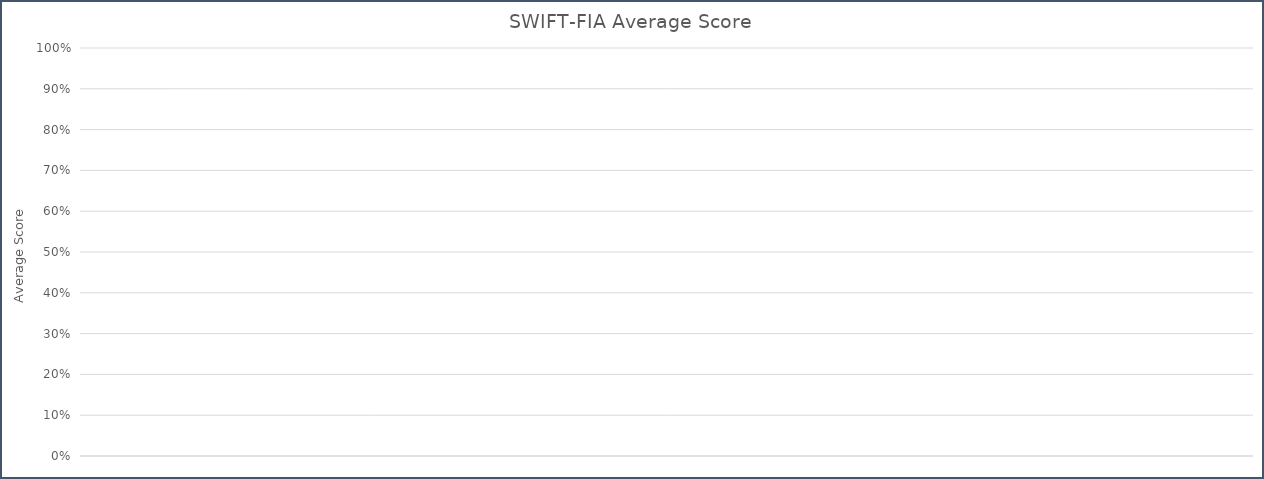
| Category | SWIFT FIA Total |
|---|---|
|  | 0 |